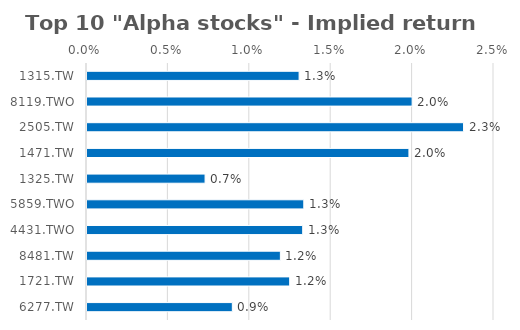
| Category | Series 0 |
|---|---|
| 1315.TW | 0.013 |
| 8119.TWO | 0.02 |
| 2505.TW | 0.023 |
| 1471.TW | 0.02 |
| 1325.TW | 0.007 |
| 5859.TWO | 0.013 |
| 4431.TWO | 0.013 |
| 8481.TW | 0.012 |
| 1721.TW | 0.012 |
| 6277.TW | 0.009 |